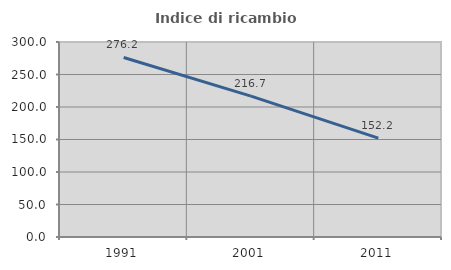
| Category | Indice di ricambio occupazionale  |
|---|---|
| 1991.0 | 276.19 |
| 2001.0 | 216.667 |
| 2011.0 | 152.174 |